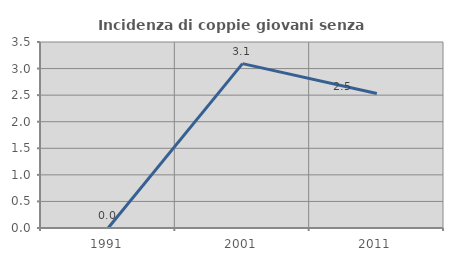
| Category | Incidenza di coppie giovani senza figli |
|---|---|
| 1991.0 | 0 |
| 2001.0 | 3.093 |
| 2011.0 | 2.532 |